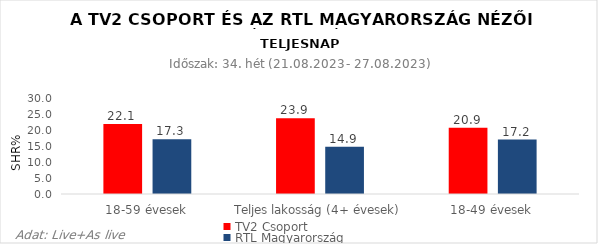
| Category | TV2 Csoport | RTL Magyarország |
|---|---|---|
| 18-59 évesek | 22.1 | 17.3 |
| Teljes lakosság (4+ évesek) | 23.9 | 14.9 |
| 18-49 évesek | 20.9 | 17.2 |